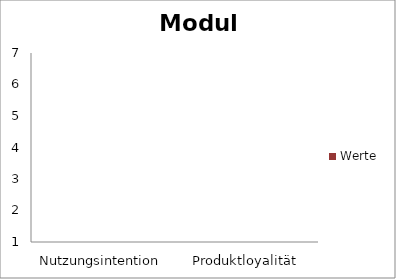
| Category | Werte |
|---|---|
| Nutzungsintention | 0 |
| Produktloyalität | 0 |